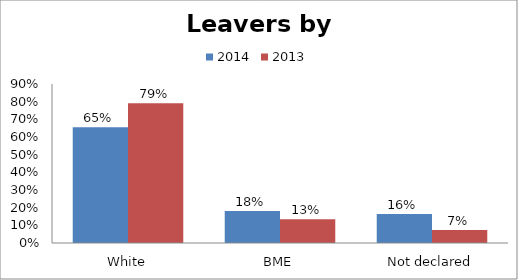
| Category | 2014 | 2013 |
|---|---|---|
| White | 0.655 | 0.792 |
| BME | 0.182 | 0.134 |
| Not declared | 0.164 | 0.074 |